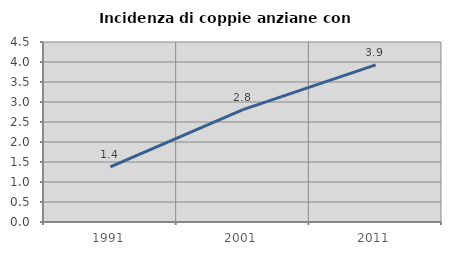
| Category | Incidenza di coppie anziane con figli |
|---|---|
| 1991.0 | 1.379 |
| 2001.0 | 2.808 |
| 2011.0 | 3.927 |